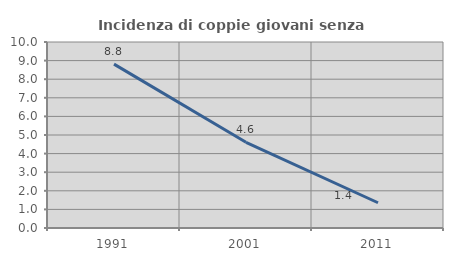
| Category | Incidenza di coppie giovani senza figli |
|---|---|
| 1991.0 | 8.808 |
| 2001.0 | 4.608 |
| 2011.0 | 1.357 |